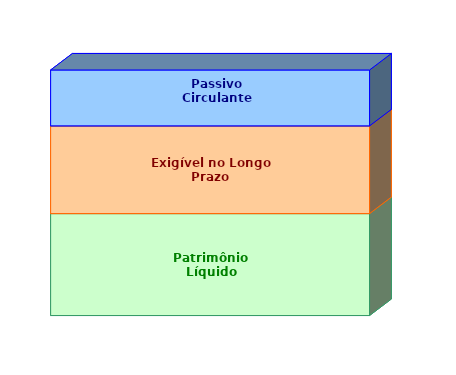
| Category | Patrimônio Líquido | Exigível no Longo Prazo | Passivo Circulante |
|---|---|---|---|
| 0 | 0.415 | 0.357 | 0.228 |